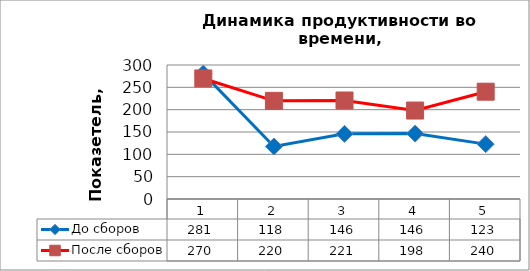
| Category | До сборов | После сборов |
|---|---|---|
| 0 | 280.779 | 269.887 |
| 1 | 117.562 | 219.779 |
| 2 | 145.811 | 220.538 |
| 3 | 146.392 | 198.044 |
| 4 | 122.857 | 240.246 |